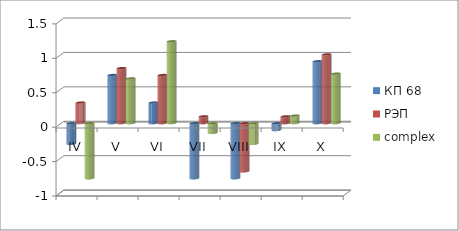
| Category | КП 68 | РЭП  | complex |
|---|---|---|---|
| IV | -0.3 | 0.3 | -0.8 |
| V | 0.7 | 0.8 | 0.65 |
| VI | 0.3 | 0.7 | 1.19 |
| VII | -0.8 | 0.1 | -0.14 |
| VIII | -0.8 | -0.7 | -0.3 |
| IX | -0.1 | 0.1 | 0.11 |
| X | 0.9 | 1 | 0.72 |